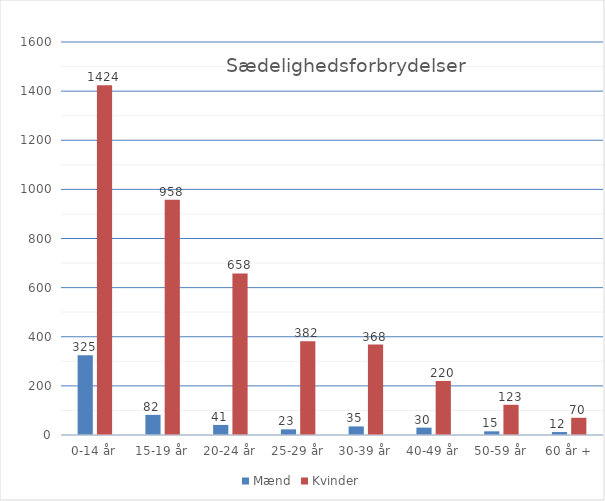
| Category | Mænd | Kvinder |
|---|---|---|
| 0-14 år | 325 | 1424 |
| 15-19 år | 82 | 958 |
| 20-24 år | 41 | 658 |
| 25-29 år | 23 | 382 |
| 30-39 år | 35 | 368 |
| 40-49 år | 30 | 220 |
| 50-59 år | 15 | 123 |
| 60 år + | 12 | 70 |